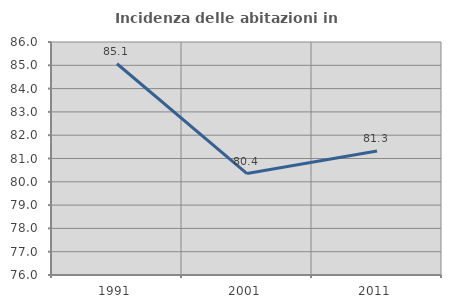
| Category | Incidenza delle abitazioni in proprietà  |
|---|---|
| 1991.0 | 85.067 |
| 2001.0 | 80.353 |
| 2011.0 | 81.322 |